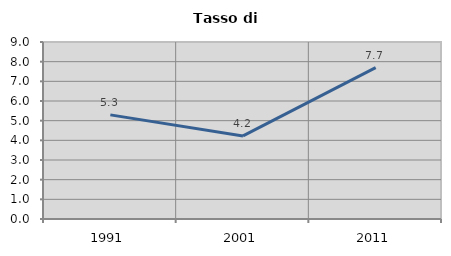
| Category | Tasso di disoccupazione   |
|---|---|
| 1991.0 | 5.295 |
| 2001.0 | 4.225 |
| 2011.0 | 7.697 |